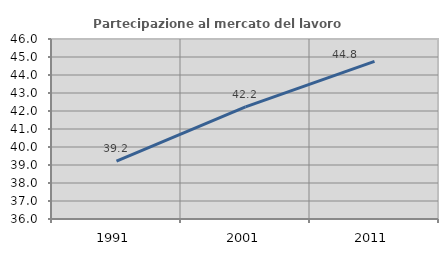
| Category | Partecipazione al mercato del lavoro  femminile |
|---|---|
| 1991.0 | 39.219 |
| 2001.0 | 42.228 |
| 2011.0 | 44.76 |